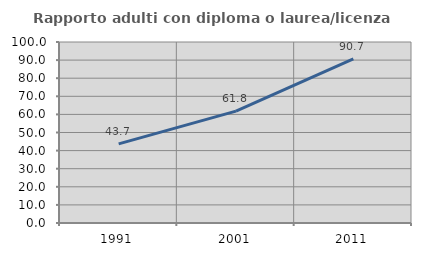
| Category | Rapporto adulti con diploma o laurea/licenza media  |
|---|---|
| 1991.0 | 43.713 |
| 2001.0 | 61.813 |
| 2011.0 | 90.731 |